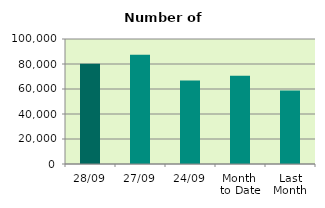
| Category | Series 0 |
|---|---|
| 28/09 | 80186 |
| 27/09 | 87482 |
| 24/09 | 66752 |
| Month 
to Date | 70560.4 |
| Last
Month | 58874.818 |